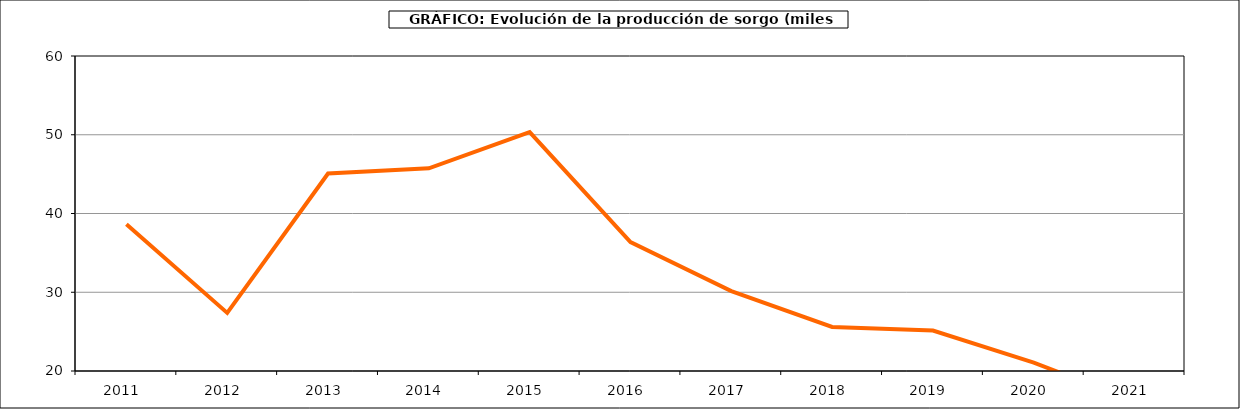
| Category | Producción |
|---|---|
| 2011.0 | 38.643 |
| 2012.0 | 27.38 |
| 2013.0 | 45.085 |
| 2014.0 | 45.744 |
| 2015.0 | 50.335 |
| 2016.0 | 36.361 |
| 2017.0 | 30.138 |
| 2018.0 | 25.589 |
| 2019.0 | 25.141 |
| 2020.0 | 21.073 |
| 2021.0 | 16.116 |